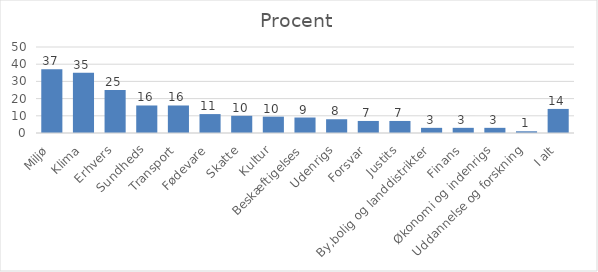
| Category | Procent |
|---|---|
| Miljø | 37 |
| Klima | 35 |
| Erhvers | 25 |
| Sundheds | 16 |
| Transport | 16 |
| Fødevare | 11 |
| Skatte | 10 |
| Kultur | 9.5 |
| Beskæftigelses | 9 |
| Udenrigs | 8 |
| Forsvar | 7 |
| Justits | 7 |
| By,bolig og landdistrikter | 3 |
| Finans | 3 |
| Økonomi og indenrigs | 3 |
| Uddannelse og forskning | 1 |
| I alt | 14 |